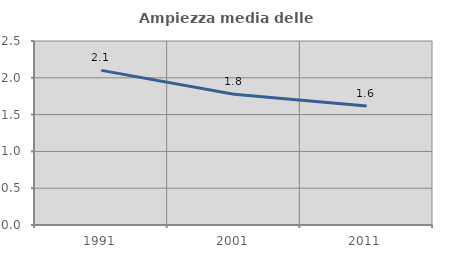
| Category | Ampiezza media delle famiglie |
|---|---|
| 1991.0 | 2.101 |
| 2001.0 | 1.777 |
| 2011.0 | 1.615 |